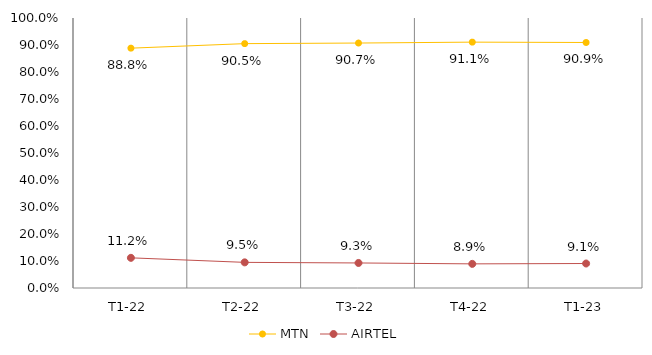
| Category | MTN | AIRTEL |
|---|---|---|
| T1-22 | 0.888 | 0.112 |
| T2-22 | 0.905 | 0.095 |
| T3-22 | 0.907 | 0.093 |
| T4-22 | 0.911 | 0.089 |
| T1-23 | 0.909 | 0.091 |